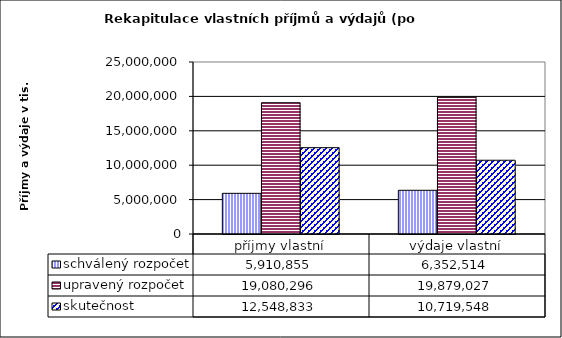
| Category | schválený rozpočet | upravený rozpočet | skutečnost |
|---|---|---|---|
| příjmy vlastní | 5910855 | 19080296 | 12548833 |
| výdaje vlastní | 6352514 | 19879027 | 10719548 |